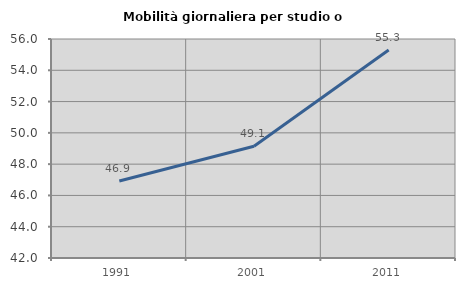
| Category | Mobilità giornaliera per studio o lavoro |
|---|---|
| 1991.0 | 46.922 |
| 2001.0 | 49.139 |
| 2011.0 | 55.3 |